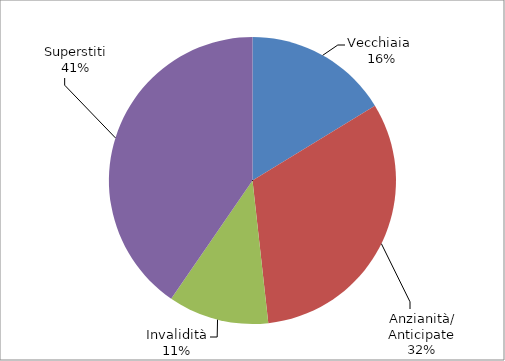
| Category | Series 0 |
|---|---|
| Vecchiaia  | 51900 |
| Anzianità/ Anticipate | 102035 |
| Invalidità | 36205 |
| Superstiti | 128937 |